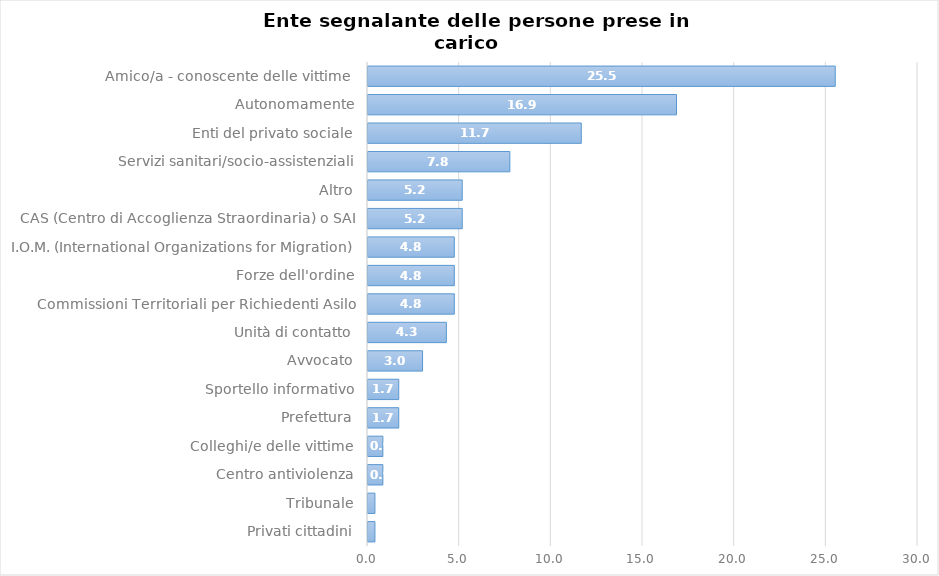
| Category | Series 0 |
|---|---|
| Privati cittadini | 0.433 |
| Tribunale | 0.433 |
| Centro antiviolenza | 0.866 |
| Colleghi/e delle vittime | 0.866 |
| Prefettura | 1.732 |
| Sportello informativo | 1.732 |
| Avvocato | 3.03 |
| Unità di contatto | 4.329 |
| Commissioni Territoriali per Richiedenti Asilo | 4.762 |
| Forze dell'ordine | 4.762 |
| I.O.M. (International Organizations for Migration) | 4.762 |
| CAS (Centro di Accoglienza Straordinaria) o SAI | 5.195 |
| Altro | 5.195 |
| Servizi sanitari/socio-assistenziali | 7.792 |
| Enti del privato sociale | 11.688 |
| Autonomamente | 16.883 |
| Amico/a - conoscente delle vittime  | 25.541 |